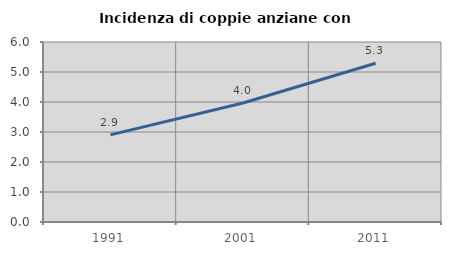
| Category | Incidenza di coppie anziane con figli |
|---|---|
| 1991.0 | 2.904 |
| 2001.0 | 3.968 |
| 2011.0 | 5.293 |